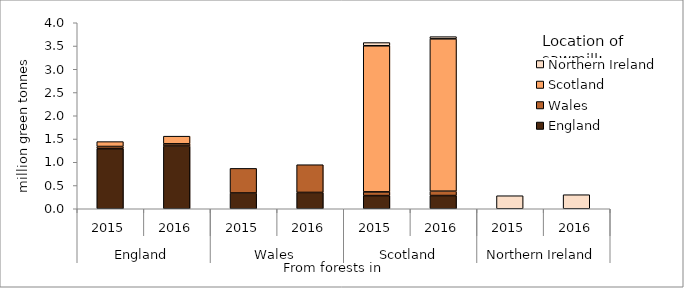
| Category | England | Wales | Scotland | Northern Ireland |
|---|---|---|---|---|
| 0 | 1293 | 46 | 105 | 0 |
| 1 | 1349 | 47 | 165 | 0 |
| 2 | 339 | 529 | 0 | 0 |
| 3 | 351 | 596 | 0 | 0 |
| 4 | 283 | 80 | 3142 | 69 |
| 5 | 284 | 94 | 3276 | 47 |
| 6 | 0 | 0 | 0 | 280 |
| 7 | 0 | 0 | 0 | 302 |